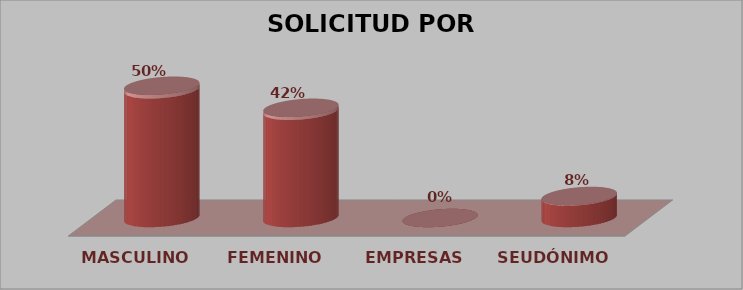
| Category | SOLICITUD POR GÉNERO | Series 1 |
|---|---|---|
| MASCULINO | 18 | 0.5 |
| FEMENINO | 15 | 0.417 |
| EMPRESAS | 0 | 0 |
| SEUDÓNIMO | 3 | 0.083 |